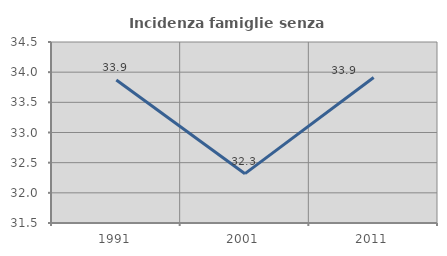
| Category | Incidenza famiglie senza nuclei |
|---|---|
| 1991.0 | 33.87 |
| 2001.0 | 32.318 |
| 2011.0 | 33.913 |